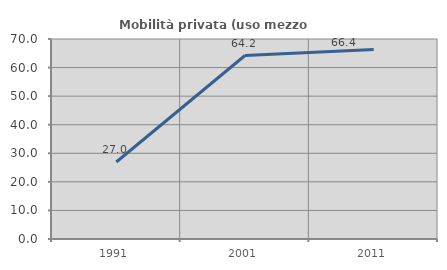
| Category | Mobilità privata (uso mezzo privato) |
|---|---|
| 1991.0 | 26.957 |
| 2001.0 | 64.223 |
| 2011.0 | 66.355 |